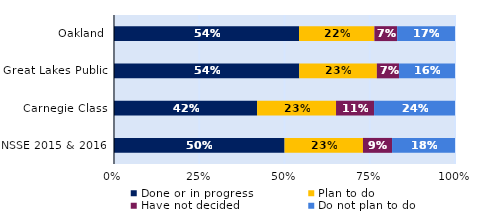
| Category | Done or in progress | Plan to do | Have not decided | Do not plan to do |
|---|---|---|---|---|
| Oakland | 0.543 | 0.221 | 0.067 | 0.17 |
| Great Lakes Public | 0.543 | 0.228 | 0.065 | 0.164 |
| Carnegie Class | 0.42 | 0.231 | 0.112 | 0.237 |
| NSSE 2015 & 2016 | 0.5 | 0.23 | 0.085 | 0.185 |